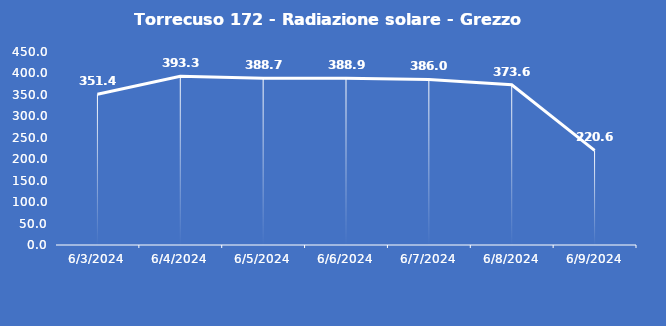
| Category | Torrecuso 172 - Radiazione solare - Grezzo (W/m2) |
|---|---|
| 6/3/24 | 351.4 |
| 6/4/24 | 393.3 |
| 6/5/24 | 388.7 |
| 6/6/24 | 388.9 |
| 6/7/24 | 386 |
| 6/8/24 | 373.6 |
| 6/9/24 | 220.6 |